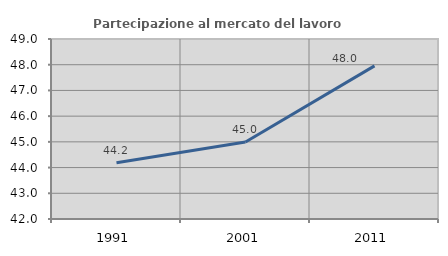
| Category | Partecipazione al mercato del lavoro  femminile |
|---|---|
| 1991.0 | 44.184 |
| 2001.0 | 44.995 |
| 2011.0 | 47.955 |